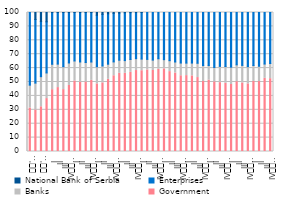
| Category | Government | Banks | Enterprises | National Bank of Serbia |
|---|---|---|---|---|
| 
'08 | 31.291 | 16.447 | 52.262 | 0 |
|  | 29.887 | 19.325 | 45.804 | 4.984 |
| 
'10 | 32.179 | 21.652 | 39.665 | 6.503 |
|  | 38.066 | 18.448 | 36.78 | 6.706 |
| I | 44.49 | 18.27 | 37.24 | 6.602 |
| II | 45.988 | 16.883 | 37.129 | 6.814 |
| III | 44.539 | 16.474 | 38.987 | 6.204 |
| IV
2012 | 47.513 | 16.181 | 36.306 | 5.415 |
| I | 50.704 | 14.432 | 34.864 | 4.685 |
| II | 49.857 | 14.545 | 35.598 | 4.172 |
| III | 49.994 | 14.026 | 35.98 | 3.477 |
| IV
2013 | 51.16 | 13.222 | 35.619 | 2.719 |
| I | 48.661 | 12.328 | 36.99 | 2.021 |
| II | 49.383 | 12.132 | 37.162 | 1.323 |
| III | 51.893 | 10.911 | 36.253 | 0.944 |
| IV
2014 | 54.493 | 9.967 | 34.949 | 0.591 |
| I | 56.273 | 9.408 | 33.912 | 0.407 |
| II | 56.26 | 9.127 | 34.418 | 0.194 |
| III | 56.908 | 9.265 | 33.715 | 0.112 |
| IV
2015 | 58.247 | 8.549 | 33.148 | 0.056 |
| I | 58.122 | 8.368 | 33.482 | 0.028 |
| II | 58.669 | 7.611 | 33.72 | 0 |
| III | 58.285 | 7.49 | 34.225 | 0 |
| IV
2016 | 59.181 | 7.541 | 33.278 | 0 |
| I | 59.444 | 6.621 | 33.935 | 0 |
| II | 57.482 | 7.844 | 34.674 | 0 |
| III | 56.477 | 7.915 | 35.608 | 0 |
| IV
2017 | 54.493 | 9.15 | 36.357 | 0 |
| I | 54.595 | 8.998 | 36.407 | 0 |
| II | 54.412 | 9.222 | 36.366 | 0 |
| III | 53.196 | 10.29 | 36.514 | 0 |
| IV
2018 | 50.351 | 11.489 | 38.16 | 0 |
| I | 51.317 | 10.529 | 38.154 | 0 |
| II | 50.105 | 10.35 | 39.545 | 0 |
| III | 49.556 | 11.696 | 38.748 | 0 |
| IV
2019 | 49.078 | 12.048 | 38.874 | 0 |
| I | 48.221 | 12.471 | 39.308 | 0 |
| II | 50.217 | 12.119 | 37.664 | 0 |
| III | 49.332 | 12.616 | 38.052 | 0 |
| IV
2020 | 48.651 | 12.412 | 38.937 | 0 |
| I | 50.404 | 11.443 | 38.153 | 0 |
| II | 50.331 | 11.025 | 38.644 | 0 |
| III | 52.643 | 10.27 | 37.087 | 0 |
| IV
2021 | 52.393 | 10.907 | 36.699 | 0 |